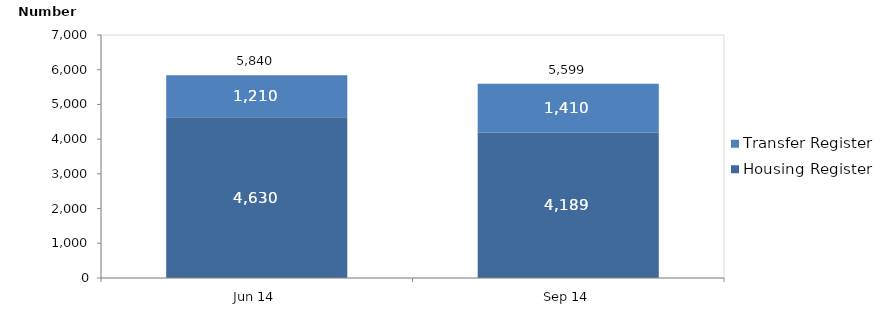
| Category | Housing Register | Transfer Register |
|---|---|---|
| Jun 14 | 4630 | 1210 |
| Sep 14 | 4189 | 1410 |